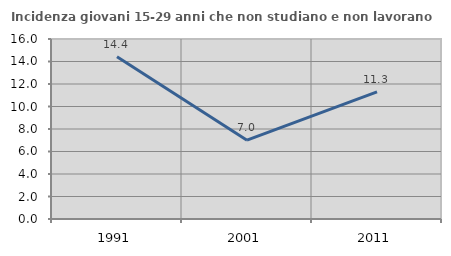
| Category | Incidenza giovani 15-29 anni che non studiano e non lavorano  |
|---|---|
| 1991.0 | 14.421 |
| 2001.0 | 7.008 |
| 2011.0 | 11.307 |